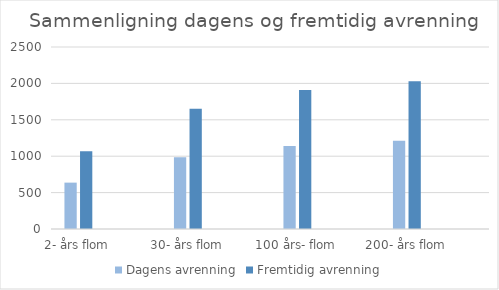
| Category | Dagens avrenning | Fremtidig avrenning |
|---|---|---|
| 2- års flom | 637 | 1068 |
|  | 0 | 0 |
| 30- års flom | 985 | 1651 |
|  | 0 | 0 |
| 100 års- flom | 1139 | 1910 |
|  | 0 | 0 |
| 200- års flom | 1212 | 2031 |